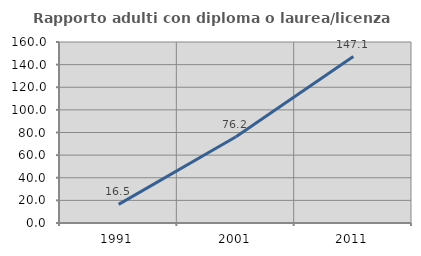
| Category | Rapporto adulti con diploma o laurea/licenza media  |
|---|---|
| 1991.0 | 16.471 |
| 2001.0 | 76.19 |
| 2011.0 | 147.126 |